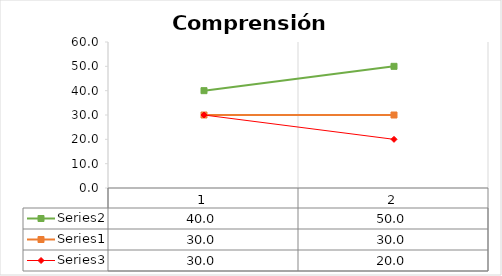
| Category | Series 1 | Series 0 | Series 2 |
|---|---|---|---|
| 0 | 40 | 30 | 30 |
| 1 | 50 | 30 | 20 |